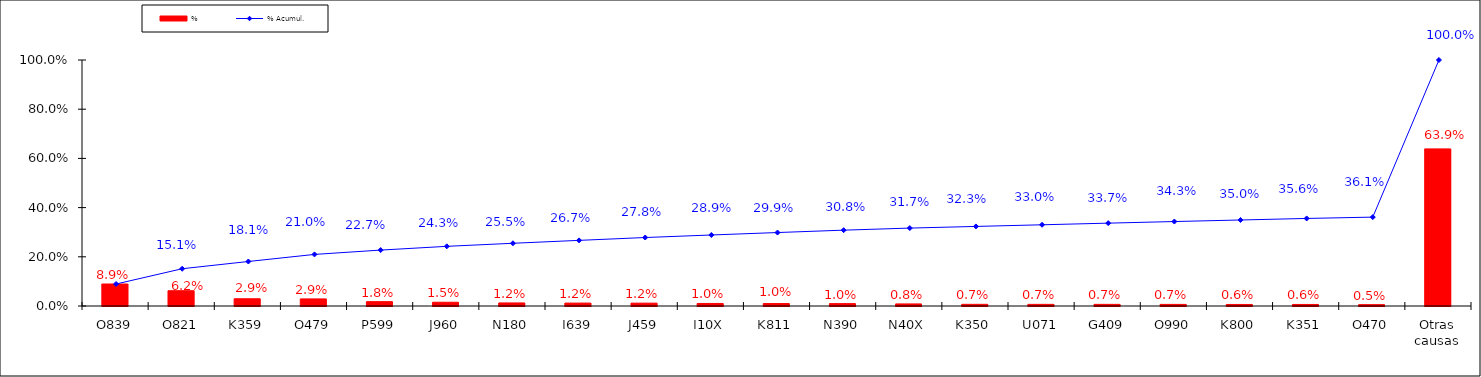
| Category | % |
|---|---|
| O839 | 0.089 |
| O821 | 0.062 |
| K359 | 0.029 |
| O479 | 0.029 |
| P599 | 0.018 |
| J960 | 0.015 |
| N180 | 0.012 |
| I639 | 0.012 |
| J459 | 0.012 |
| I10X | 0.01 |
| K811 | 0.01 |
| N390 | 0.01 |
| N40X | 0.008 |
| K350 | 0.007 |
| U071 | 0.007 |
| G409 | 0.007 |
| O990 | 0.007 |
| K800 | 0.006 |
| K351 | 0.006 |
| O470 | 0.005 |
| Otras causas | 0.639 |